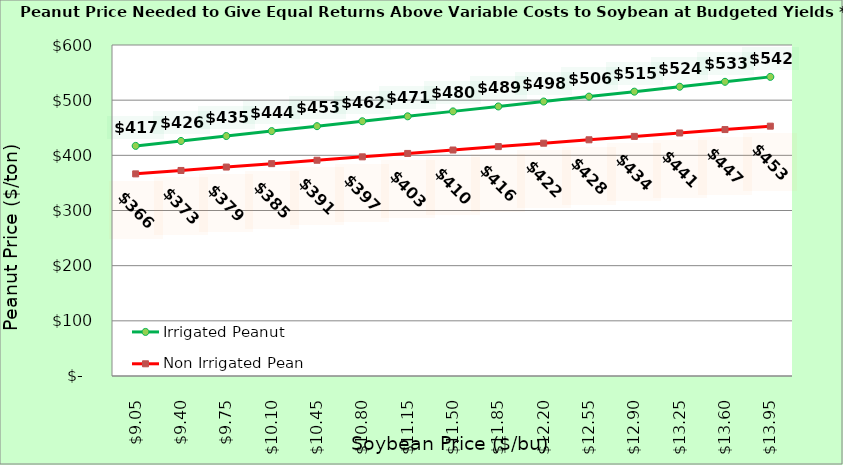
| Category | Irrigated Peanut | Non Irrigated Peanut |
|---|---|---|
| 9.050000000000002 | 417.114 | 366.403 |
| 9.400000000000002 | 426.05 | 372.579 |
| 9.750000000000002 | 434.986 | 378.756 |
| 10.100000000000001 | 443.922 | 384.932 |
| 10.450000000000001 | 452.858 | 391.109 |
| 10.8 | 461.795 | 397.285 |
| 11.15 | 470.731 | 403.461 |
| 11.5 | 479.667 | 409.638 |
| 11.85 | 488.603 | 415.814 |
| 12.2 | 497.539 | 421.991 |
| 12.549999999999999 | 506.476 | 428.167 |
| 12.899999999999999 | 515.412 | 434.344 |
| 13.249999999999998 | 524.348 | 440.52 |
| 13.599999999999998 | 533.284 | 446.697 |
| 13.949999999999998 | 542.22 | 452.873 |